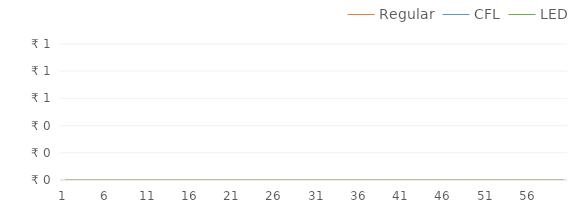
| Category | Regular | CFL | LED |
|---|---|---|---|
| 1.0 | 0 | 0 | 0 |
| 2.0 | 0 | 0 | 0 |
| 3.0 | 0 | 0 | 0 |
| 4.0 | 0 | 0 | 0 |
| 5.0 | 0 | 0 | 0 |
| 6.0 | 0 | 0 | 0 |
| 7.0 | 0 | 0 | 0 |
| 8.0 | 0 | 0 | 0 |
| 9.0 | 0 | 0 | 0 |
| 10.0 | 0 | 0 | 0 |
| 11.0 | 0 | 0 | 0 |
| 12.0 | 0 | 0 | 0 |
| 13.0 | 0 | 0 | 0 |
| 14.0 | 0 | 0 | 0 |
| 15.0 | 0 | 0 | 0 |
| 16.0 | 0 | 0 | 0 |
| 17.0 | 0 | 0 | 0 |
| 18.0 | 0 | 0 | 0 |
| 19.0 | 0 | 0 | 0 |
| 20.0 | 0 | 0 | 0 |
| 21.0 | 0 | 0 | 0 |
| 22.0 | 0 | 0 | 0 |
| 23.0 | 0 | 0 | 0 |
| 24.0 | 0 | 0 | 0 |
| 25.0 | 0 | 0 | 0 |
| 26.0 | 0 | 0 | 0 |
| 27.0 | 0 | 0 | 0 |
| 28.0 | 0 | 0 | 0 |
| 29.0 | 0 | 0 | 0 |
| 30.0 | 0 | 0 | 0 |
| 31.0 | 0 | 0 | 0 |
| 32.0 | 0 | 0 | 0 |
| 33.0 | 0 | 0 | 0 |
| 34.0 | 0 | 0 | 0 |
| 35.0 | 0 | 0 | 0 |
| 36.0 | 0 | 0 | 0 |
| 37.0 | 0 | 0 | 0 |
| 38.0 | 0 | 0 | 0 |
| 39.0 | 0 | 0 | 0 |
| 40.0 | 0 | 0 | 0 |
| 41.0 | 0 | 0 | 0 |
| 42.0 | 0 | 0 | 0 |
| 43.0 | 0 | 0 | 0 |
| 44.0 | 0 | 0 | 0 |
| 45.0 | 0 | 0 | 0 |
| 46.0 | 0 | 0 | 0 |
| 47.0 | 0 | 0 | 0 |
| 48.0 | 0 | 0 | 0 |
| 49.0 | 0 | 0 | 0 |
| 50.0 | 0 | 0 | 0 |
| 51.0 | 0 | 0 | 0 |
| 52.0 | 0 | 0 | 0 |
| 53.0 | 0 | 0 | 0 |
| 54.0 | 0 | 0 | 0 |
| 55.0 | 0 | 0 | 0 |
| 56.0 | 0 | 0 | 0 |
| 57.0 | 0 | 0 | 0 |
| 58.0 | 0 | 0 | 0 |
| 59.0 | 0 | 0 | 0 |
| 60.0 | 0 | 0 | 0 |